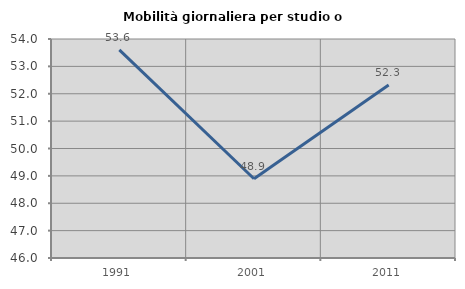
| Category | Mobilità giornaliera per studio o lavoro |
|---|---|
| 1991.0 | 53.605 |
| 2001.0 | 48.894 |
| 2011.0 | 52.319 |